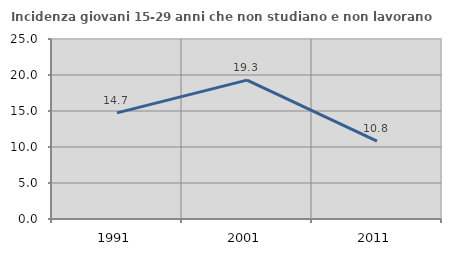
| Category | Incidenza giovani 15-29 anni che non studiano e non lavorano  |
|---|---|
| 1991.0 | 14.741 |
| 2001.0 | 19.289 |
| 2011.0 | 10.828 |